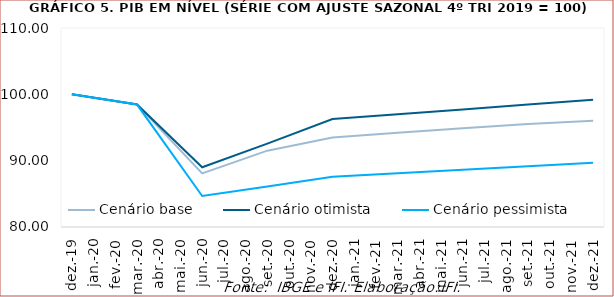
| Category | Cenário base | Cenário otimista | Cenário pessimista |
|---|---|---|---|
| 2019-12-01 | 100 | 100 | 100 |
| 2020-03-01 | 98.461 | 98.461 | 98.461 |
| 2020-06-01 | 88.073 | 89.008 | 84.676 |
| 2020-09-01 | 91.508 | 92.569 | 86.116 |
| 2020-12-01 | 93.475 | 96.271 | 87.58 |
| 2021-03-01 | 94.214 | 96.993 | 88.105 |
| 2021-06-01 | 94.873 | 97.721 | 88.634 |
| 2021-09-01 | 95.537 | 98.454 | 89.165 |
| 2021-12-01 | 96.015 | 99.192 | 89.7 |